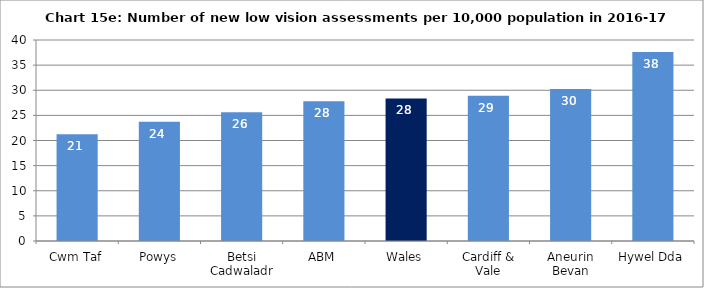
| Category | Chart 15e: Number of new low vision assessments per 10,000 population in 2016-17 |
|---|---|
| Cwm Taf | 21.265 |
| Powys | 23.748 |
| Betsi Cadwaladr | 25.645 |
| ABM | 27.823 |
| Wales | 28.37 |
| Cardiff & Vale | 28.881 |
| Aneurin Bevan | 30.269 |
| Hywel Dda | 37.628 |